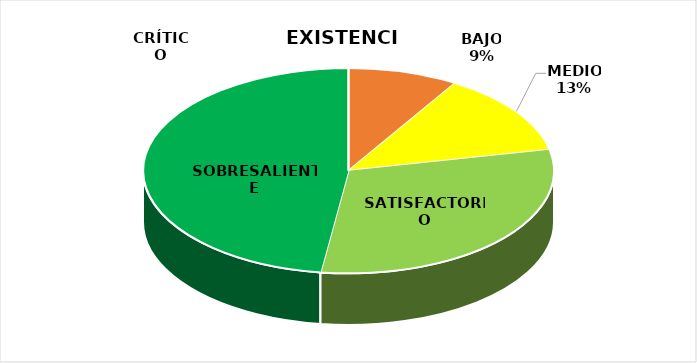
| Category | Series 1 | Series 0 |
|---|---|---|
| CRÍTICO | 0 | 2 |
| BAJO | 2 | 4 |
| MEDIO | 3 | 1 |
| SATISFACTORIO | 7 | 1 |
| SOBRESALIENTE | 11 | 49 |